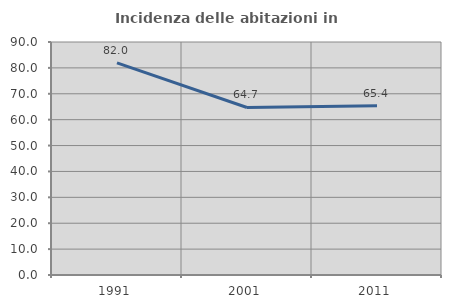
| Category | Incidenza delle abitazioni in proprietà  |
|---|---|
| 1991.0 | 81.954 |
| 2001.0 | 64.706 |
| 2011.0 | 65.351 |